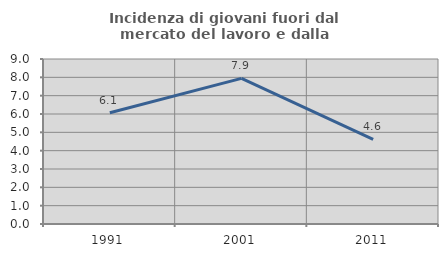
| Category | Incidenza di giovani fuori dal mercato del lavoro e dalla formazione  |
|---|---|
| 1991.0 | 6.068 |
| 2001.0 | 7.945 |
| 2011.0 | 4.619 |